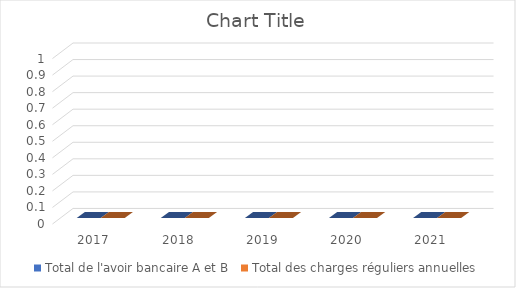
| Category | Total de l'avoir bancaire A et B | Total des charges réguliers annuelles |
|---|---|---|
| 2017 | 0 | 0 |
| 2018 | 0 | 0 |
| 2019 | 0 | 0 |
| 2020 | 0 | 0 |
| 2021 | 0 | 0 |